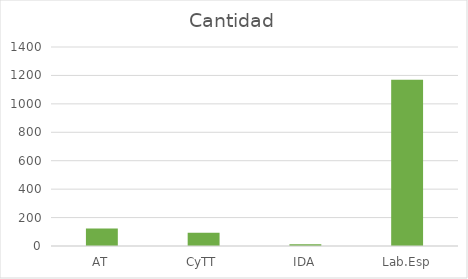
| Category | Cantidad |
|---|---|
| AT | 123 |
| CyTT | 93 |
| IDA | 13 |
| Lab.Esp | 1169 |